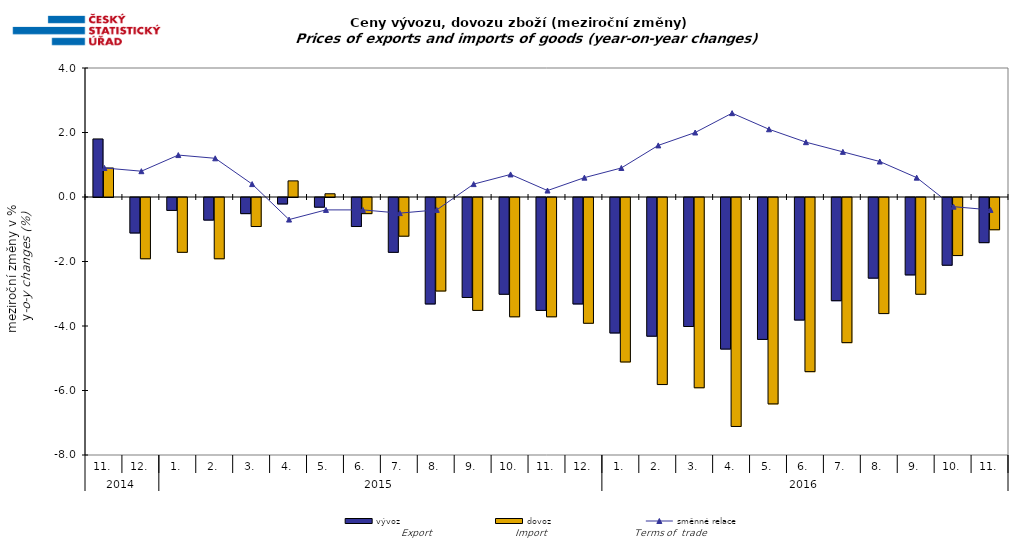
| Category | vývoz | dovoz |
|---|---|---|
| 0 | 1.8 | 0.9 |
| 1 | -1.1 | -1.9 |
| 2 | -0.4 | -1.7 |
| 3 | -0.7 | -1.9 |
| 4 | -0.5 | -0.9 |
| 5 | -0.2 | 0.5 |
| 6 | -0.3 | 0.1 |
| 7 | -0.9 | -0.5 |
| 8 | -1.7 | -1.2 |
| 9 | -3.3 | -2.9 |
| 10 | -3.1 | -3.5 |
| 11 | -3 | -3.7 |
| 12 | -3.5 | -3.7 |
| 13 | -3.3 | -3.9 |
| 14 | -4.2 | -5.1 |
| 15 | -4.3 | -5.8 |
| 16 | -4 | -5.9 |
| 17 | -4.7 | -7.1 |
| 18 | -4.4 | -6.4 |
| 19 | -3.8 | -5.4 |
| 20 | -3.2 | -4.5 |
| 21 | -2.5 | -3.6 |
| 22 | -2.4 | -3 |
| 23 | -2.1 | -1.8 |
| 24 | -1.4 | -1 |